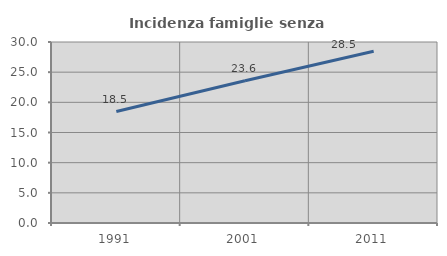
| Category | Incidenza famiglie senza nuclei |
|---|---|
| 1991.0 | 18.472 |
| 2001.0 | 23.586 |
| 2011.0 | 28.455 |